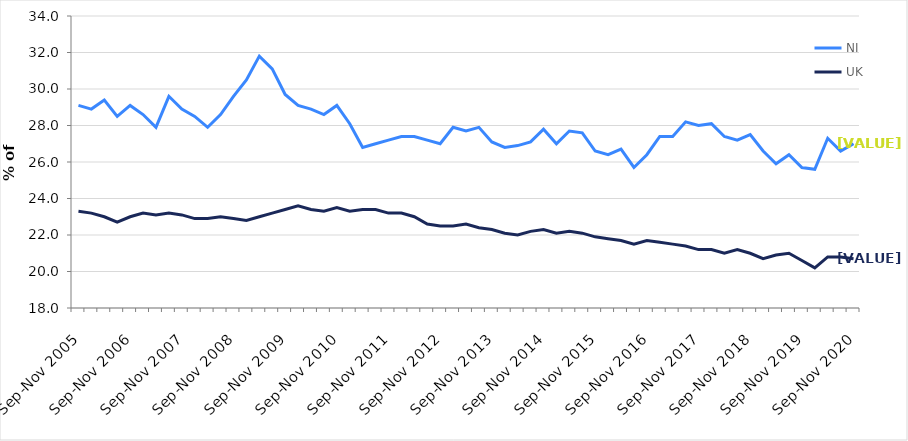
| Category | NI | UK |
|---|---|---|
| Sep-Nov 2005 | 29.1 | 23.3 |
| Dec-Feb 2006 | 28.9 | 23.2 |
| Mar-May 2006 | 29.4 | 23 |
| Jun-Aug 2006 | 28.5 | 22.7 |
| Sep-Nov 2006 | 29.1 | 23 |
| Dec-Feb 2007 | 28.6 | 23.2 |
| Mar-May 2007 | 27.9 | 23.1 |
| Jun-Aug 2007 | 29.6 | 23.2 |
| Sep-Nov 2007 | 28.9 | 23.1 |
| Dec-Feb 2008 | 28.5 | 22.9 |
| Mar-May 2008 | 27.9 | 22.9 |
| Jun-Aug 2008 | 28.6 | 23 |
| Sep-Nov 2008 | 29.6 | 22.9 |
| Dec-Feb 2009 | 30.5 | 22.8 |
| Mar-May 2009 | 31.8 | 23 |
| Jun-Aug 2009 | 31.1 | 23.2 |
| Sep-Nov 2009 | 29.7 | 23.4 |
| Dec-Feb 2010 | 29.1 | 23.6 |
| Mar-May 2010 | 28.9 | 23.4 |
| Jun-Aug 2010 | 28.6 | 23.3 |
| Sep-Nov 2010 | 29.1 | 23.5 |
| Dec-Feb 2011 | 28.1 | 23.3 |
| Mar-May 2011 | 26.8 | 23.4 |
| Jun-Aug 2011 | 27 | 23.4 |
| Sep-Nov 2011 | 27.2 | 23.2 |
| Dec-Feb 2012 | 27.4 | 23.2 |
| Mar-May 2012 | 27.4 | 23 |
| Jun-Aug 2012 | 27.2 | 22.6 |
| Sep-Nov 2012 | 27 | 22.5 |
| Dec-Feb 2013 | 27.9 | 22.5 |
| Mar-May 2013 | 27.7 | 22.6 |
| Jun-Aug 2013 | 27.9 | 22.4 |
| Sep-Nov 2013 | 27.1 | 22.3 |
| Dec-Feb 2014 | 26.8 | 22.1 |
| Mar-May 2014 | 26.9 | 22 |
| Jun-Aug 2014 | 27.1 | 22.2 |
| Sep-Nov 2014 | 27.8 | 22.3 |
| Dec-Feb 2015 | 27 | 22.1 |
| Mar-May 2015 | 27.7 | 22.2 |
| Jun-Aug 2015 | 27.6 | 22.1 |
| Sep-Nov 2015 | 26.6 | 21.9 |
| Dec-Feb 2016 | 26.4 | 21.8 |
| Mar-May 2016 | 26.7 | 21.7 |
| Jun-Aug 2016 | 25.7 | 21.5 |
| Sep-Nov 2016 | 26.4 | 21.7 |
| Dec-Feb 2017 | 27.4 | 21.6 |
| Mar-May 2017 | 27.4 | 21.5 |
| Jun-Aug 2017 | 28.2 | 21.4 |
| Sep-Nov 2017 | 28 | 21.2 |
| Dec-Feb 2018 | 28.1 | 21.2 |
| Mar-May 2018 | 27.4 | 21 |
| Jun-Aug 2018 | 27.2 | 21.2 |
| Sep-Nov 2018 | 27.5 | 21 |
| Dec-Feb 2019 | 26.6 | 20.7 |
| Mar-May 2019 | 25.9 | 20.9 |
| Jun-Aug 2019 | 26.4 | 21 |
| Sep-Nov 2019 | 25.7 | 20.6 |
| Dec-Feb 2020 | 25.6 | 20.2 |
| Mar-May 2020 | 27.3 | 20.8 |
| Jun-Aug 2020 | 26.6 | 20.8 |
| Sep-Nov 2020 | 27 | 20.7 |